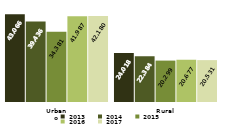
| Category | 2013 | 2014 | 2015 | 2016 | 2017 |
|---|---|---|---|---|---|
| Urbano | 43066 | 39436 | 34381 | 41987 | 42180 |
| Rural | 24018 | 22384 | 20299 | 20677 | 20531 |